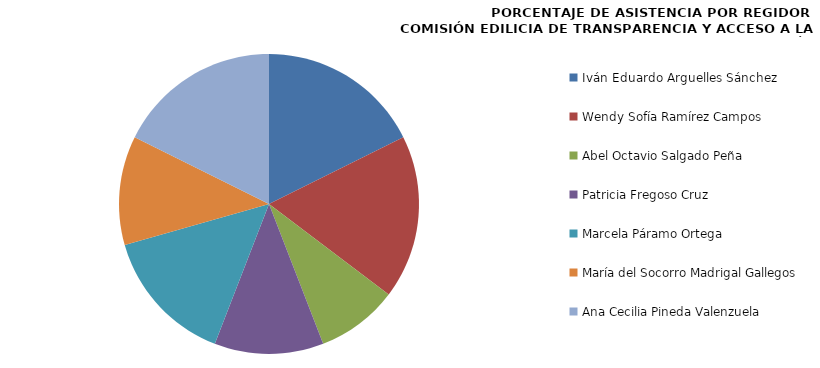
| Category | Series 0 |
|---|---|
| Iván Eduardo Arguelles Sánchez  | 100 |
| Wendy Sofía Ramírez Campos | 100 |
| Abel Octavio Salgado Peña | 50 |
| Patricia Fregoso Cruz | 66.667 |
| Marcela Páramo Ortega | 83.333 |
| María del Socorro Madrigal Gallegos | 66.667 |
| Ana Cecilia Pineda Valenzuela | 100 |